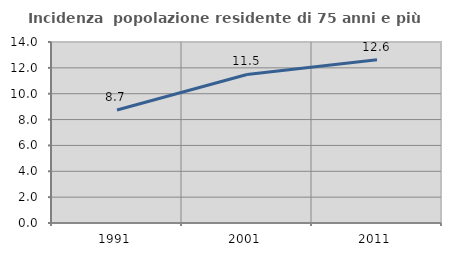
| Category | Incidenza  popolazione residente di 75 anni e più |
|---|---|
| 1991.0 | 8.74 |
| 2001.0 | 11.487 |
| 2011.0 | 12.619 |